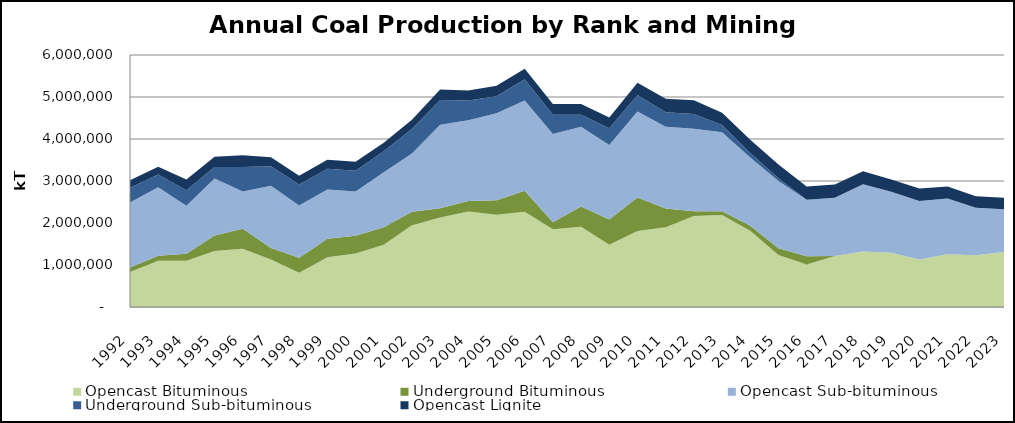
| Category | Opencast Bituminous | Underground Bituminous | Opencast Sub-bituminous | Underground Sub-bituminous | Opencast Lignite |
|---|---|---|---|---|---|
| 1992.0 | 831702 | 109448 | 1547466 | 349777 | 179666 |
| 1993.0 | 1099770 | 121368 | 1627377 | 304680 | 183613 |
| 1994.0 | 1102782 | 162585 | 1143184 | 373143 | 251541 |
| 1995.0 | 1331970 | 370033 | 1356856 | 275080 | 242882 |
| 1996.0 | 1387675 | 475252 | 884808 | 586543 | 276274 |
| 1997.0 | 1130219 | 273304 | 1482313.63 | 468234 | 213341.44 |
| 1998.0 | 814808 | 360142 | 1241500 | 503125 | 206795 |
| 1999.0 | 1184154 | 443054 | 1172162 | 494443 | 211917 |
| 2000.0 | 1273992 | 421224 | 1054882 | 494703 | 212616 |
| 2001.0 | 1482386 | 414385 | 1310795 | 500886 | 202944 |
| 2002.0 | 1948906 | 320000 | 1386813 | 584981 | 218239 |
| 2003.0 | 2129000 | 222000 | 1985354 | 591201 | 252336 |
| 2004.0 | 2271311 | 255302 | 1917825 | 471528 | 239428 |
| 2005.0 | 2198389 | 345015 | 2067892 | 409420 | 246445 |
| 2006.0 | 2267870 | 500779 | 2147044 | 506472 | 251366 |
| 2007.0 | 1852554 | 166247 | 2102359 | 453471 | 260148 |
| 2008.0 | 1912683 | 480662 | 1897968 | 286802 | 253492 |
| 2009.0 | 1485005.09 | 600481 | 1770812.557 | 397223 | 259704.12 |
| 2010.0 | 1811578.41 | 797189 | 2043597.75 | 394610 | 294934 |
| 2011.0 | 1899150 | 444874 | 1949526 | 345289 | 320144 |
| 2012.0 | 2164261.88 | 115081 | 1967032 | 349878 | 325919 |
| 2013.0 | 2189357.48 | 89900 | 1878808.5 | 176992 | 290405 |
| 2014.0 | 1815127.22 | 120754 | 1624952 | 106922 | 316692 |
| 2015.0 | 1237445 | 163441 | 1599733 | 65943 | 324086 |
| 2016.0 | 1013416 | 191972 | 1348199 | 0 | 313035 |
| 2017.0 | 1212126 | 0 | 1386950 | 0 | 319487 |
| 2018.0 | 1318966 | 0 | 1604454 | 0 | 307378 |
| 2019.0 | 1291197 | 0 | 1454956 | 0 | 287830 |
| 2020.0 | 1128917 | 0 | 1392075 | 0 | 297690 |
| 2021.0 | 1256583.7 | 0 | 1326291.67 | 0 | 284734.915 |
| 2022.0 | 1230681.04 | 0 | 1130547.1 | 0 | 276247.93 |
| 2023.0 | 1306699.44 | 0 | 1017951.59 | 0 | 275433.09 |